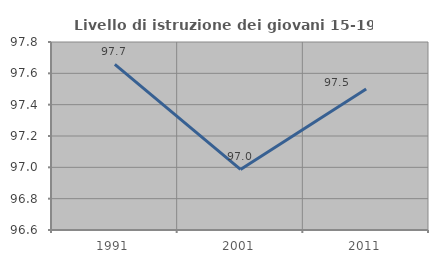
| Category | Livello di istruzione dei giovani 15-19 anni |
|---|---|
| 1991.0 | 97.657 |
| 2001.0 | 96.987 |
| 2011.0 | 97.5 |